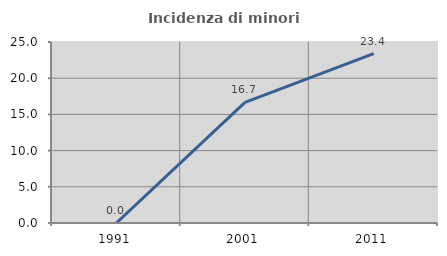
| Category | Incidenza di minori stranieri |
|---|---|
| 1991.0 | 0 |
| 2001.0 | 16.667 |
| 2011.0 | 23.404 |